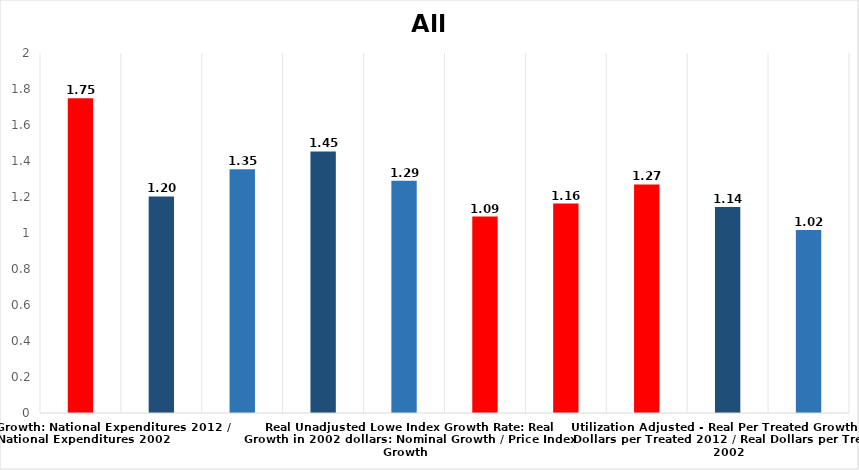
| Category | All Disease |
|---|---|
| Nominal Growth: National Expenditures 2012 / National Expenditures 2002 | 1.748 |
| Price Index Growth: Yearly All Disease Utilization Adjusted Price Index 2012 / Yearly All Disease Utilization Adjusted Price Ind | 1.203 |
| Price Index Growth: Yearly All Disease Lowe Price Index 2012 / Yearly All Disease Lowe Price Index 2002 | 1.354 |
|  Real Utilization Adjusted Growth Rate: Real Growth in 2002 dollars: Nominal Growth / Price Index Growth | 1.453 |
|  Real Unadjusted Lowe Index Growth Rate: Real Growth in 2002 dollars: Nominal Growth / Price Index Growth | 1.291 |
| Population Growth Rate: US Population 2012 / US Population 2002 | 1.091 |
| Prevalence Growth: % of Population with Disease: % of Population with Disease 2012/ % of Population with Disease in 2002 | 1.164 |
| Growth in Population Treated for Disease | 1.27 |
| Utilization Adjusted - Real Per Treated Growth: Real Dollars per Treated 2012 / Real Dollars per Treated 2002 | 1.144 |
| Unadjusted Lowe Index - Real Per Treated Growth: Real Dollars per Treated 2012 / Real Dollars per Treated 2002 | 1.017 |